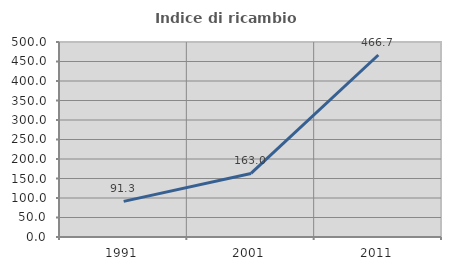
| Category | Indice di ricambio occupazionale  |
|---|---|
| 1991.0 | 91.304 |
| 2001.0 | 163.014 |
| 2011.0 | 466.667 |